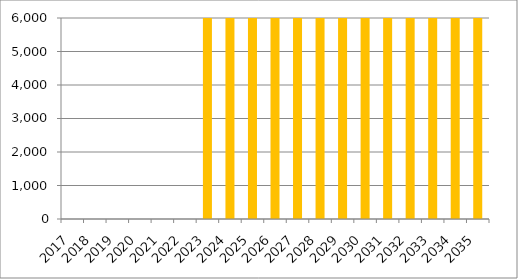
| Category | Series 0 |
|---|---|
| 2017.0 | -1755788.643 |
| 2018.0 | -470120.349 |
| 2019.0 | -346772.353 |
| 2020.0 | -171187.78 |
| 2021.0 | -138099.665 |
| 2022.0 | -41161.38 |
| 2023.0 | 35417.976 |
| 2024.0 | 84960.16 |
| 2025.0 | 136962.348 |
| 2026.0 | 150612.66 |
| 2027.0 | 151439.952 |
| 2028.0 | 155576.41 |
| 2029.0 | 152267.243 |
| 2030.0 | 146269.379 |
| 2031.0 | 3146379.642 |
| 2032.0 | 446738.216 |
| 2033.0 | 439626.41 |
| 2034.0 | 440671.41 |
| 2035.0 | 440671.41 |